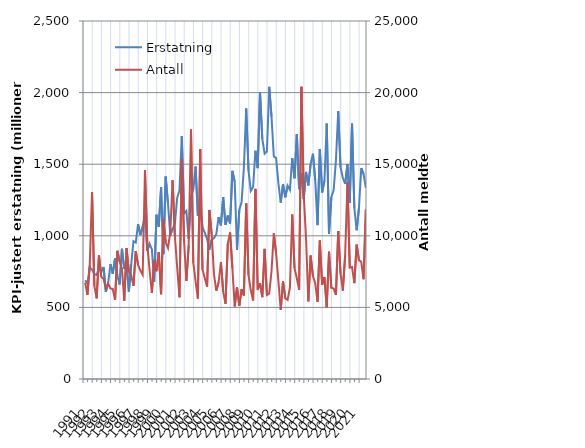
| Category | Erstatning |
|---|---|
| 1991.0 | 689.374 |
| nan | 666.894 |
| nan | 778.133 |
| nan | 764.907 |
| 1992.0 | 731.882 |
| nan | 727.208 |
| nan | 776.459 |
| nan | 745.324 |
| 1993.0 | 782.622 |
| nan | 607.8 |
| nan | 670.591 |
| nan | 802.547 |
| 1994.0 | 734.838 |
| nan | 842.978 |
| nan | 722.495 |
| nan | 659.654 |
| 1995.0 | 909.176 |
| nan | 768.464 |
| nan | 810.842 |
| nan | 611.488 |
| 1996.0 | 796.7 |
| nan | 962.483 |
| nan | 952.884 |
| nan | 1081.216 |
| 1997.0 | 1005.654 |
| nan | 1063.482 |
| nan | 1152.959 |
| nan | 896.353 |
| 1998.0 | 944.295 |
| nan | 904.9 |
| nan | 678.191 |
| nan | 1147.03 |
| 1999.0 | 1062.77 |
| nan | 1338.301 |
| nan | 871.881 |
| nan | 1413.509 |
| 2000.0 | 1225.813 |
| nan | 1003.185 |
| nan | 1048.804 |
| nan | 1082.395 |
| 2001.0 | 1265.218 |
| nan | 1317.001 |
| nan | 1695.786 |
| nan | 1155.695 |
| 2002.0 | 1173.818 |
| nan | 979.681 |
| nan | 1278.333 |
| nan | 1322.228 |
| 2003.0 | 1483.611 |
| nan | 1138.839 |
| nan | 1202.166 |
| nan | 1058.724 |
| 2004.0 | 1021.086 |
| nan | 976.786 |
| nan | 903.296 |
| nan | 973.154 |
| 2005.0 | 983.699 |
| nan | 1012.023 |
| nan | 1130.564 |
| nan | 1072.855 |
| 2006.0 | 1270.393 |
| nan | 1075.992 |
| nan | 1141.091 |
| nan | 1085.496 |
| 2007.0 | 1453.648 |
| nan | 1377.06 |
| nan | 902.201 |
| nan | 1180.267 |
| 2008.0 | 1236.198 |
| nan | 1478.992 |
| nan | 1888.435 |
| nan | 1454.744 |
| 2009.0 | 1313.509 |
| nan | 1341.029 |
| nan | 1593.905 |
| nan | 1472.687 |
| 2010.0 | 2003.113 |
| nan | 1676.316 |
| nan | 1573.884 |
| nan | 1589.066 |
| 2011.0 | 2040.332 |
| nan | 1830.54 |
| nan | 1553.457 |
| nan | 1542.115 |
| 2012.0 | 1365.922 |
| nan | 1232.315 |
| nan | 1361.826 |
| nan | 1268.865 |
| 2013.0 | 1350.066 |
| nan | 1320.139 |
| nan | 1542.162 |
| nan | 1401.643 |
| 2014.0 | 1710.003 |
| nan | 1325.632 |
| nan | 1438.142 |
| nan | 1255.22 |
| 2015.0 | 1446.15 |
| nan | 1351.835 |
| nan | 1501.279 |
| nan | 1573.052 |
| 2016.0 | 1388.7 |
| nan | 1074.557 |
| nan | 1606.313 |
| nan | 1302.798 |
| 2017.0 | 1384.869 |
| nan | 1784.337 |
| nan | 1012.84 |
| nan | 1269.838 |
| 2018.0 | 1318.356 |
| nan | 1526.482 |
| nan | 1871.334 |
| nan | 1478.409 |
| 2019.0 | 1405.033 |
| nan | 1362.292 |
| nan | 1501.153 |
| nan | 1229.981 |
| 2020.0 | 1783.259 |
| nan | 1194.46 |
| nan | 1038.756 |
| nan | 1194.231 |
| 2021.0 | 1472.531 |
| nan | 1432.586 |
| nan | 1334.073 |